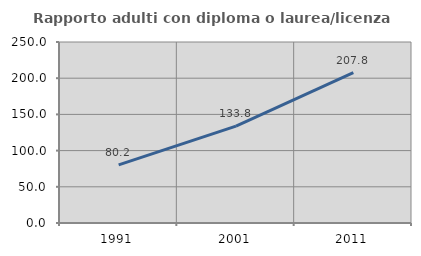
| Category | Rapporto adulti con diploma o laurea/licenza media  |
|---|---|
| 1991.0 | 80.185 |
| 2001.0 | 133.827 |
| 2011.0 | 207.839 |